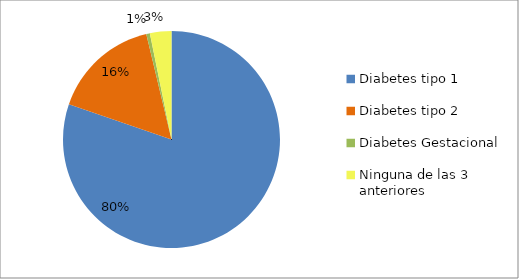
| Category | Series 0 | Series 1 | Series 2 |
|---|---|---|---|
| Diabetes tipo 1 |  |  | 301 |
| Diabetes tipo 2 |  |  | 60 |
| Diabetes Gestacional |  |  | 2 |
| Ninguna de las 3 anteriores |  |  | 12 |